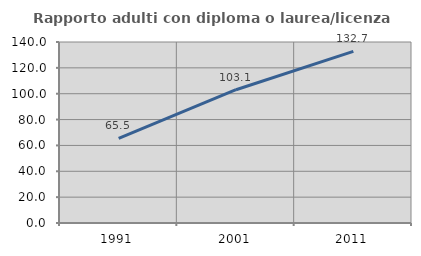
| Category | Rapporto adulti con diploma o laurea/licenza media  |
|---|---|
| 1991.0 | 65.517 |
| 2001.0 | 103.101 |
| 2011.0 | 132.727 |